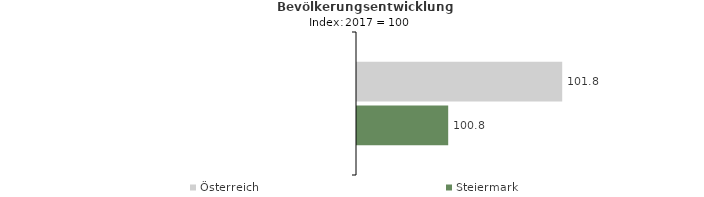
| Category | Österreich | Steiermark |
|---|---|---|
| 2021.0 | 101.8 | 100.8 |